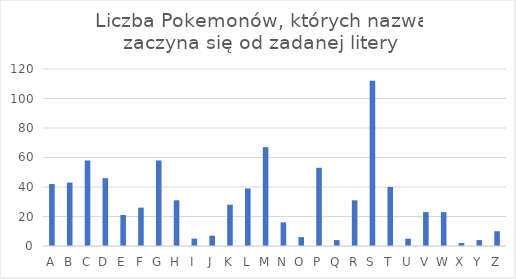
| Category | Liczba Pokemonów |
|---|---|
| A | 42 |
| B | 43 |
| C | 58 |
| D | 46 |
| E | 21 |
| F | 26 |
| G | 58 |
| H | 31 |
| I | 5 |
| J | 7 |
| K | 28 |
| L | 39 |
| M | 67 |
| N | 16 |
| O | 6 |
| P | 53 |
| Q | 4 |
| R | 31 |
| S | 112 |
| T | 40 |
| U | 5 |
| V | 23 |
| W | 23 |
| X | 2 |
| Y | 4 |
| Z | 10 |